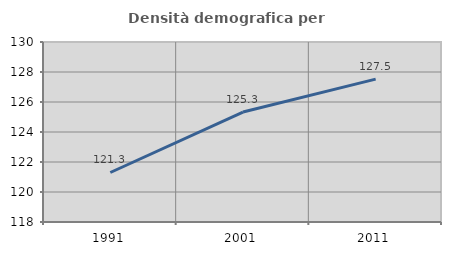
| Category | Densità demografica |
|---|---|
| 1991.0 | 121.301 |
| 2001.0 | 125.332 |
| 2011.0 | 127.526 |